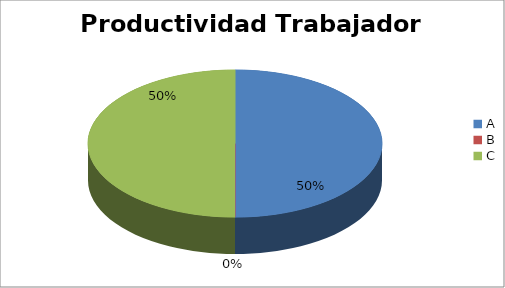
| Category | Series 0 |
|---|---|
| A | 50 |
| B | 0 |
| C | 50 |